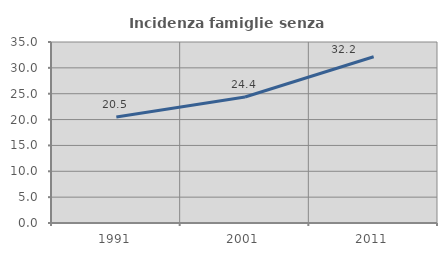
| Category | Incidenza famiglie senza nuclei |
|---|---|
| 1991.0 | 20.486 |
| 2001.0 | 24.364 |
| 2011.0 | 32.152 |